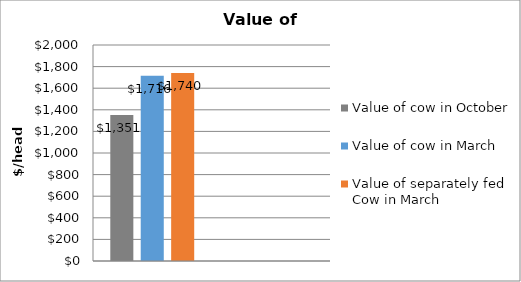
| Category | Value of cow in October | Value of cow in March | Value of separately fed Cow in March |
|---|---|---|---|
|  | 1350.872 | 1716.063 | 1740.442 |